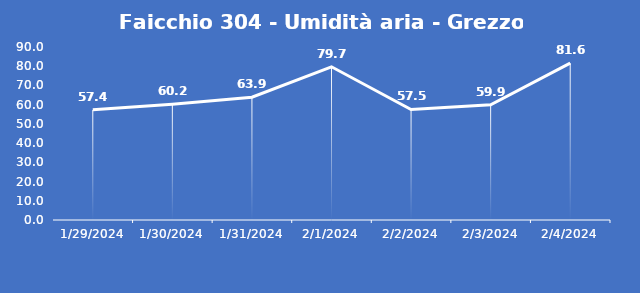
| Category | Faicchio 304 - Umidità aria - Grezzo (%) |
|---|---|
| 1/29/24 | 57.4 |
| 1/30/24 | 60.2 |
| 1/31/24 | 63.9 |
| 2/1/24 | 79.7 |
| 2/2/24 | 57.5 |
| 2/3/24 | 59.9 |
| 2/4/24 | 81.6 |